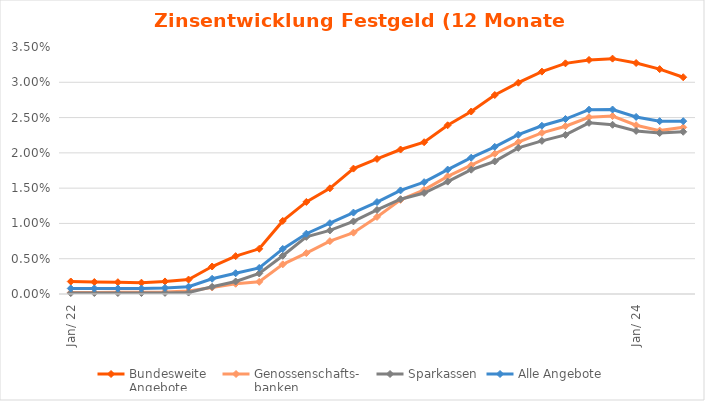
| Category | Bundesweite
Angebote | Genossenschafts-
banken | Sparkassen | Alle Angebote |
|---|---|---|---|---|
| 2022-01-01 | 0.002 | 0 | 0 | 0.001 |
| 2022-02-01 | 0.002 | 0 | 0 | 0.001 |
| 2022-03-01 | 0.002 | 0 | 0 | 0.001 |
| 2022-04-01 | 0.002 | 0 | 0 | 0.001 |
| 2022-05-01 | 0.002 | 0 | 0 | 0.001 |
| 2022-06-01 | 0.002 | 0 | 0 | 0.001 |
| 2022-07-01 | 0.004 | 0.001 | 0.001 | 0.002 |
| 2022-08-01 | 0.005 | 0.001 | 0.002 | 0.003 |
| 2022-09-01 | 0.006 | 0.002 | 0.003 | 0.004 |
| 2022-10-01 | 0.01 | 0.004 | 0.005 | 0.006 |
| 2022-11-01 | 0.013 | 0.006 | 0.008 | 0.009 |
| 2022-12-01 | 0.015 | 0.007 | 0.009 | 0.01 |
| 2023-01-01 | 0.018 | 0.009 | 0.01 | 0.012 |
| 2023-02-01 | 0.019 | 0.011 | 0.012 | 0.013 |
| 2023-03-01 | 0.02 | 0.013 | 0.013 | 0.015 |
| 2023-04-01 | 0.022 | 0.015 | 0.014 | 0.016 |
| 2023-05-01 | 0.024 | 0.017 | 0.016 | 0.018 |
| 2023-06-01 | 0.026 | 0.018 | 0.018 | 0.019 |
| 2023-07-01 | 0.028 | 0.02 | 0.019 | 0.021 |
| 2023-08-01 | 0.03 | 0.022 | 0.021 | 0.023 |
| 2023-09-01 | 0.032 | 0.023 | 0.022 | 0.024 |
| 2023-10-01 | 0.033 | 0.024 | 0.023 | 0.025 |
| 2023-11-01 | 0.033 | 0.025 | 0.024 | 0.026 |
| 2023-12-01 | 0.033 | 0.025 | 0.024 | 0.026 |
| 2024-01-01 | 0.033 | 0.024 | 0.023 | 0.025 |
| 2024-02-01 | 0.032 | 0.023 | 0.023 | 0.024 |
| 2024-03-01 | 0.031 | 0.024 | 0.023 | 0.024 |